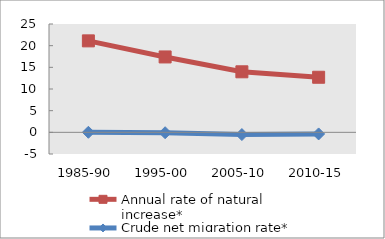
| Category | Annual rate of natural increase* | Crude net migration rate* |
|---|---|---|
| 1985-90 | 21.109 | 0.011 |
| 1995-00 | 17.397 | -0.089 |
| 2005-10 | 13.968 | -0.511 |
| 2010-15 | 12.711 | -0.369 |